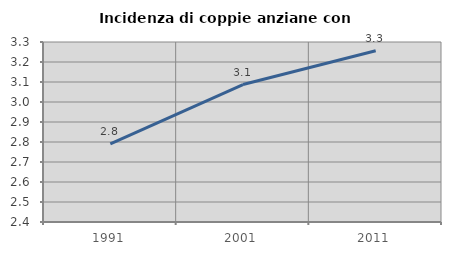
| Category | Incidenza di coppie anziane con figli |
|---|---|
| 1991.0 | 2.79 |
| 2001.0 | 3.087 |
| 2011.0 | 3.256 |